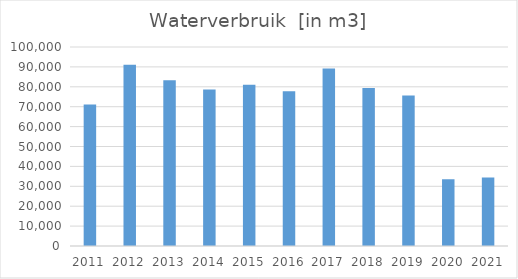
| Category | Water  |
|---|---|
| 2011.0 | 71094 |
| 2012.0 | 91081 |
| 2013.0 | 83354 |
| 2014.0 | 78633 |
| 2015.0 | 81054 |
| 2016.0 | 77766 |
| 2017.0 | 89230 |
| 2018.0 | 79451 |
| 2019.0 | 75572 |
| 2020.0 | 33551 |
| 2021.0 | 34369 |